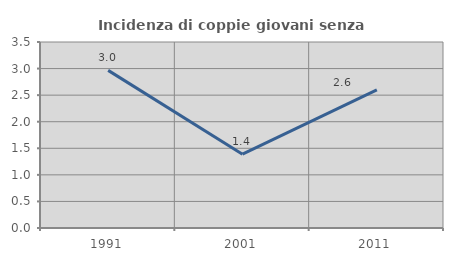
| Category | Incidenza di coppie giovani senza figli |
|---|---|
| 1991.0 | 2.966 |
| 2001.0 | 1.389 |
| 2011.0 | 2.597 |